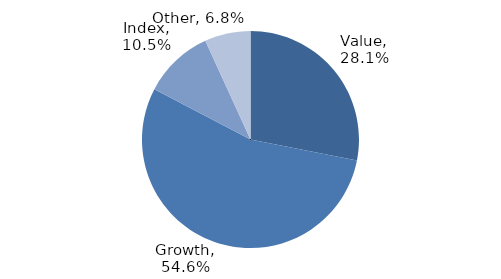
| Category | Investment Style |
|---|---|
| Value | 0.281 |
| Growth | 0.546 |
| Index | 0.105 |
| Other | 0.068 |